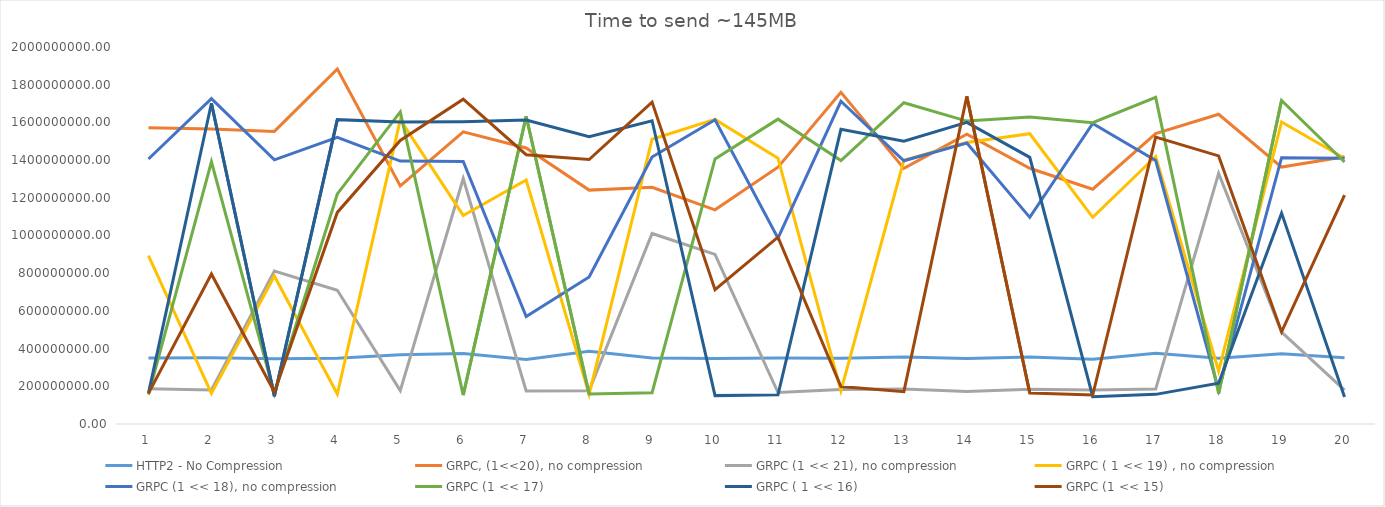
| Category | HTTP2 - No Compression | GRPC, (1<<20), no compression | GRPC (1 << 21), no compression | GRPC ( 1 << 19) , no compression | GRPC (1 << 18), no compression | GRPC (1 << 17) | GRPC ( 1 << 16) | GRPC (1 << 15) |
|---|---|---|---|---|---|---|---|---|
| 0 | 350525695 | 1571948862 | 187040040 | 893188632 | 1405965760 | 155900574 | 163440729 | 162594364 |
| 1 | 350983116 | 1564653808 | 180800072 | 161928690 | 1726282099 | 1390777648 | 1701347029 | 795424050 |
| 2 | 345803638 | 1552240584 | 811201470 | 785204059 | 1401237538 | 160826441 | 147221212 | 170055327 |
| 3 | 348316114 | 1883634526 | 709518006 | 159082202 | 1521028595 | 1220432056 | 1614591298 | 1122612435 |
| 4 | 367301560 | 1263398021 | 176995304 | 1613601874 | 1394670480 | 1655433865 | 1602531782 | 1503938812 |
| 5 | 373610431 | 1549969965 | 1301911505 | 1106375081 | 1392644602 | 153065836 | 1603723997 | 1722949407 |
| 6 | 341866557 | 1464299298 | 175344661 | 1294427575 | 570475192 | 1632745187 | 1612247771 | 1428737231 |
| 7 | 386082005 | 1240776447 | 175870161 | 158314121 | 779706148 | 159401269 | 1524051969 | 1403183277 |
| 8 | 350541114 | 1256051108 | 1010760827 | 1510538446 | 1416242052 | 166211684 | 1608757598 | 1707615539 |
| 9 | 347252824 | 1136287037 | 899742575 | 1616005502 | 1613812441 | 1406458675 | 150554261 | 712615741 |
| 10 | 350217988 | 1362270997 | 166871377 | 1410091480 | 986245385 | 1617202799 | 154458795 | 991450729 |
| 11 | 349150245 | 1759888408 | 183524707 | 175768512 | 1712054238 | 1397753366 | 1563410034 | 199021950 |
| 12 | 355609133 | 1355944258 | 185243386 | 1399270602 | 1396729835 | 1704545497 | 1500291285 | 171419108 |
| 13 | 347571813 | 1537691079 | 172205274 | 1492965004 | 1490476969 | 1606882395 | 1600325308 | 1738113276 |
| 14 | 355758872 | 1356773725 | 184436700 | 1539918816 | 1096268417 | 1628893933 | 1414668196 | 164242070 |
| 15 | 343410612 | 1245526899 | 180886679 | 1096248524 | 1594603873 | 1598509928 | 144600603 | 153478326 |
| 16 | 375394880 | 1540724847 | 185380476 | 1419001481 | 1397560626 | 1732753820 | 157241854 | 1522323917 |
| 17 | 348911673 | 1643082430 | 1329841138 | 280958884 | 178634886 | 161203236 | 216016169 | 1422391685 |
| 18 | 372189341 | 1362859453 | 487249839 | 1602218334 | 1412726360 | 1716827758 | 1118713145 | 488681504 |
| 19 | 351002339 | 1417739861 | 180047788 | 1410030339 | 1410272167 | 1389639280 | 142947075 | 1214432215 |